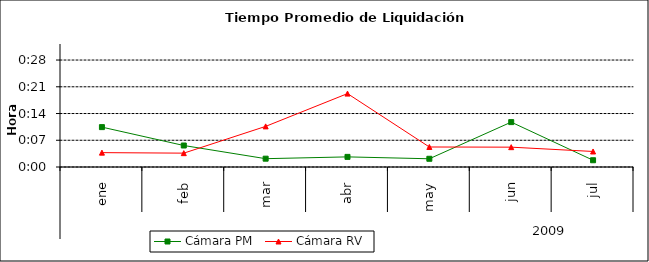
| Category | Cámara PM | Cámara RV |
|---|---|---|
| 0 | 0.007 | 0.003 |
| 1 | 0.004 | 0.003 |
| 2 | 0.002 | 0.008 |
| 3 | 0.002 | 0.014 |
| 4 | 0.002 | 0.004 |
| 5 | 0.008 | 0.004 |
| 6 | 0.001 | 0.003 |